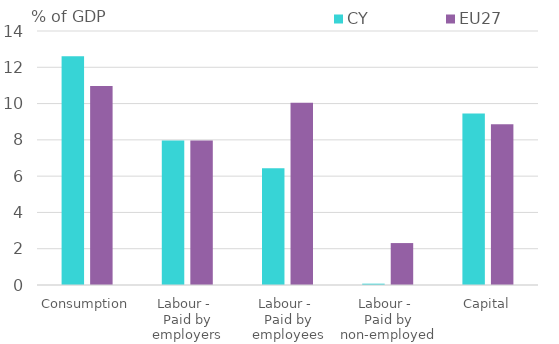
| Category | CY | EU27 |
|---|---|---|
| Consumption | 12.603 | 10.967 |
| Labour - 
Paid by employers | 7.97 | 7.966 |
| Labour - 
Paid by employees | 6.432 | 10.052 |
| Labour - 
Paid by non-employed | 0.073 | 2.311 |
| Capital | 9.457 | 8.858 |